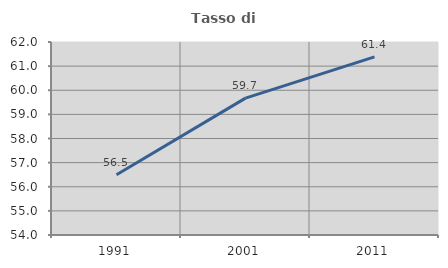
| Category | Tasso di occupazione   |
|---|---|
| 1991.0 | 56.495 |
| 2001.0 | 59.673 |
| 2011.0 | 61.382 |